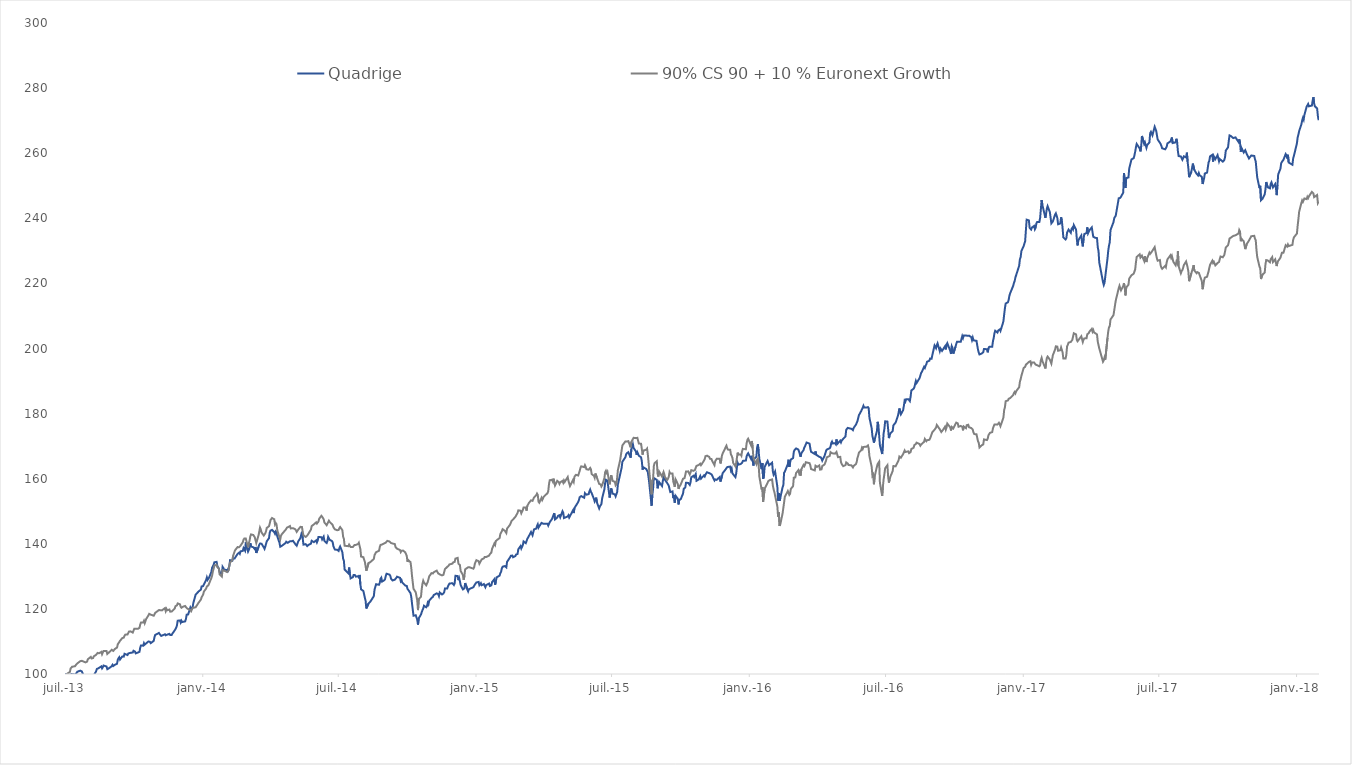
| Category |  Quadrige  |  90% CS 90 + 10 % Euronext Growth  |
|---|---|---|
| 2013-07-02 | 100 | 100 |
| 2013-07-03 | 100 | 99.527 |
| 2013-07-04 | 100 | 100.004 |
| 2013-07-05 | 100 | 100.1 |
| 2013-07-08 | 99.67 | 100.628 |
| 2013-07-09 | 99.74 | 101.683 |
| 2013-07-10 | 99.98 | 101.883 |
| 2013-07-11 | 100.09 | 102.224 |
| 2013-07-12 | 99.94 | 102.246 |
| 2013-07-15 | 99.78 | 102.405 |
| 2013-07-16 | 100.08 | 102.771 |
| 2013-07-17 | 100.35 | 102.888 |
| 2013-07-18 | 100.7 | 103.278 |
| 2013-07-19 | 100.81 | 103.387 |
| 2013-07-22 | 101.04 | 103.96 |
| 2013-07-23 | 101.19 | 104.056 |
| 2013-07-24 | 100.8 | 104.05 |
| 2013-07-25 | 100.83 | 104.173 |
| 2013-07-26 | 99.68 | 103.847 |
| 2013-07-29 | 99.56 | 103.564 |
| 2013-07-30 | 99.83 | 103.442 |
| 2013-07-31 | 99.26 | 103.801 |
| 2013-08-01 | 99.45 | 104.529 |
| 2013-08-02 | 99.39 | 104.623 |
| 2013-08-05 | 99.5 | 105.255 |
| 2013-08-06 | 99.4 | 104.771 |
| 2013-08-07 | 99.12 | 104.736 |
| 2013-08-08 | 98.98 | 104.891 |
| 2013-08-09 | 99.61 | 105.426 |
| 2013-08-12 | 100.8 | 105.894 |
| 2013-08-13 | 101.54 | 106.092 |
| 2013-08-14 | 101.75 | 106.475 |
| 2013-08-15 | 101.75 | 106.183 |
| 2013-08-16 | 101.98 | 106.371 |
| 2013-08-19 | 102.33 | 106.782 |
| 2013-08-20 | 101.74 | 106.075 |
| 2013-08-21 | 102.09 | 106.605 |
| 2013-08-22 | 102.61 | 107.067 |
| 2013-08-23 | 102.81 | 107.349 |
| 2013-08-26 | 102.3 | 107.048 |
| 2013-08-27 | 101.48 | 106.151 |
| 2013-08-28 | 101.39 | 105.879 |
| 2013-08-29 | 101.72 | 106.578 |
| 2013-08-30 | 101.7 | 106.776 |
| 2013-09-02 | 102.41 | 107.444 |
| 2013-09-03 | 102.83 | 107.382 |
| 2013-09-04 | 102.46 | 107.085 |
| 2013-09-05 | 102.72 | 107.311 |
| 2013-09-06 | 102.81 | 107.668 |
| 2013-09-09 | 103.16 | 108.131 |
| 2013-09-10 | 104.36 | 109.126 |
| 2013-09-11 | 104.83 | 109.481 |
| 2013-09-12 | 105.15 | 109.827 |
| 2013-09-13 | 104.45 | 110.193 |
| 2013-09-16 | 105.38 | 111.035 |
| 2013-09-17 | 105.23 | 110.846 |
| 2013-09-18 | 105.34 | 111.174 |
| 2013-09-19 | 106.21 | 111.726 |
| 2013-09-20 | 105.95 | 112.093 |
| 2013-09-23 | 105.83 | 112.144 |
| 2013-09-24 | 106.29 | 112.562 |
| 2013-09-25 | 106.21 | 113.041 |
| 2013-09-26 | 106.46 | 113.1 |
| 2013-09-27 | 106.7 | 113.104 |
| 2013-09-30 | 106.61 | 112.725 |
| 2013-10-01 | 107.13 | 113.304 |
| 2013-10-02 | 107.23 | 113.89 |
| 2013-10-03 | 106.89 | 113.608 |
| 2013-10-04 | 106.34 | 113.881 |
| 2013-10-07 | 106.61 | 113.903 |
| 2013-10-08 | 106.82 | 114.006 |
| 2013-10-09 | 106.82 | 114.184 |
| 2013-10-10 | 108.14 | 115.227 |
| 2013-10-11 | 108.77 | 115.833 |
| 2013-10-14 | 108.69 | 115.819 |
| 2013-10-15 | 109.49 | 116.344 |
| 2013-10-16 | 109.03 | 115.609 |
| 2013-10-17 | 109.01 | 115.806 |
| 2013-10-18 | 109.44 | 116.935 |
| 2013-10-21 | 110 | 118.017 |
| 2013-10-22 | 110.22 | 118.472 |
| 2013-10-23 | 109.88 | 118.165 |
| 2013-10-24 | 109.48 | 118.242 |
| 2013-10-25 | 109.65 | 117.959 |
| 2013-10-28 | 110.18 | 117.906 |
| 2013-10-29 | 111.28 | 118.328 |
| 2013-10-30 | 112.02 | 118.784 |
| 2013-10-31 | 111.98 | 119.022 |
| 2013-11-04 | 112.61 | 119.649 |
| 2013-11-05 | 112.24 | 119.43 |
| 2013-11-06 | 111.99 | 119.592 |
| 2013-11-07 | 111.7 | 119.546 |
| 2013-11-08 | 111.74 | 119.543 |
| 2013-11-12 | 112.2 | 120.237 |
| 2013-11-13 | 111.89 | 119.335 |
| 2013-11-14 | 112.02 | 120.009 |
| 2013-11-15 | 112.09 | 119.57 |
| 2013-11-18 | 112.32 | 119.813 |
| 2013-11-19 | 112 | 119.162 |
| 2013-11-20 | 111.97 | 119.176 |
| 2013-11-21 | 112 | 119.167 |
| 2013-11-22 | 112.43 | 119.356 |
| 2013-11-25 | 113.4 | 120.084 |
| 2013-11-26 | 113.76 | 120.815 |
| 2013-11-27 | 114.2 | 121.044 |
| 2013-11-28 | 114.88 | 121.092 |
| 2013-11-29 | 116.37 | 121.682 |
| 2013-12-02 | 116.46 | 121.428 |
| 2013-12-03 | 115.8 | 120.673 |
| 2013-12-04 | 116.37 | 120.357 |
| 2013-12-05 | 115.96 | 120.342 |
| 2013-12-06 | 116.15 | 120.66 |
| 2013-12-09 | 116.16 | 120.896 |
| 2013-12-10 | 116.87 | 120.567 |
| 2013-12-11 | 118.23 | 120.748 |
| 2013-12-12 | 118.23 | 120.07 |
| 2013-12-13 | 118.3 | 119.882 |
| 2013-12-16 | 120.47 | 119.69 |
| 2013-12-17 | 120.06 | 119.312 |
| 2013-12-18 | 119.84 | 119.494 |
| 2013-12-19 | 120.56 | 120.291 |
| 2013-12-20 | 121.89 | 120.04 |
| 2013-12-23 | 124.37 | 120.505 |
| 2013-12-24 | 124.56 | 120.859 |
| 2013-12-27 | 125.37 | 121.916 |
| 2013-12-30 | 125.92 | 122.861 |
| 2013-12-31 | 126.91 | 123.603 |
| 2014-01-02 | 127 | 124.378 |
| 2014-01-03 | 127.26 | 125.33 |
| 2014-01-06 | 128.88 | 126.251 |
| 2014-01-07 | 129.67 | 126.884 |
| 2014-01-08 | 128.93 | 127.039 |
| 2014-01-09 | 129.09 | 127.242 |
| 2014-01-10 | 129.63 | 127.808 |
| 2014-01-13 | 131.38 | 129.474 |
| 2014-01-14 | 132.66 | 130.226 |
| 2014-01-15 | 132.93 | 131.512 |
| 2014-01-16 | 133.53 | 132.321 |
| 2014-01-17 | 134.32 | 133.272 |
| 2014-01-20 | 134.44 | 133.576 |
| 2014-01-21 | 133.15 | 132.816 |
| 2014-01-22 | 132.79 | 132.885 |
| 2014-01-23 | 132.38 | 132.404 |
| 2014-01-24 | 131.42 | 130.631 |
| 2014-01-27 | 130.61 | 129.953 |
| 2014-01-28 | 132.93 | 131.928 |
| 2014-01-29 | 132.57 | 131.798 |
| 2014-01-30 | 132.01 | 131.79 |
| 2014-01-31 | 131.77 | 131.547 |
| 2014-02-03 | 131.97 | 131.33 |
| 2014-02-04 | 131.28 | 131.173 |
| 2014-02-05 | 132.53 | 131.834 |
| 2014-02-06 | 133.2 | 133.315 |
| 2014-02-07 | 134.96 | 134.232 |
| 2014-02-10 | 134.79 | 135.02 |
| 2014-02-11 | 135.55 | 136.265 |
| 2014-02-12 | 135.58 | 136.399 |
| 2014-02-13 | 135.47 | 137.64 |
| 2014-02-14 | 135.67 | 138.118 |
| 2014-02-17 | 136.89 | 138.988 |
| 2014-02-18 | 137.09 | 138.7 |
| 2014-02-19 | 137.25 | 138.939 |
| 2014-02-20 | 136.92 | 138.859 |
| 2014-02-21 | 137.69 | 139.438 |
| 2014-02-24 | 137.83 | 140.465 |
| 2014-02-25 | 138.68 | 141.287 |
| 2014-02-26 | 138.42 | 141.6 |
| 2014-02-27 | 137.88 | 141.374 |
| 2014-02-28 | 140.44 | 141.595 |
| 2014-03-03 | 137.61 | 138.936 |
| 2014-03-04 | 138.09 | 140.19 |
| 2014-03-05 | 138.78 | 140.935 |
| 2014-03-06 | 140.2 | 142.266 |
| 2014-03-07 | 139.17 | 142.879 |
| 2014-03-10 | 138.93 | 142.706 |
| 2014-03-11 | 138.7 | 142.936 |
| 2014-03-12 | 138.37 | 141.994 |
| 2014-03-13 | 139.03 | 141.804 |
| 2014-03-14 | 137.19 | 140.234 |
| 2014-03-17 | 139.01 | 142.599 |
| 2014-03-18 | 139.71 | 143.774 |
| 2014-03-19 | 140.08 | 144.962 |
| 2014-03-20 | 140.14 | 144.431 |
| 2014-03-21 | 140.04 | 143.493 |
| 2014-03-24 | 138.89 | 142.536 |
| 2014-03-25 | 138.43 | 142.492 |
| 2014-03-26 | 139.12 | 143.212 |
| 2014-03-27 | 139 | 143.849 |
| 2014-03-28 | 140.77 | 144.879 |
| 2014-03-31 | 141.74 | 145.404 |
| 2014-04-01 | 143.45 | 146.243 |
| 2014-04-02 | 144.05 | 147.28 |
| 2014-04-03 | 143.95 | 147.496 |
| 2014-04-04 | 144.27 | 147.919 |
| 2014-04-07 | 143.59 | 147.542 |
| 2014-04-08 | 143.12 | 145.966 |
| 2014-04-09 | 143.8 | 146.369 |
| 2014-04-10 | 143.48 | 146.036 |
| 2014-04-11 | 142.36 | 144.221 |
| 2014-04-14 | 140.31 | 141.997 |
| 2014-04-15 | 139.09 | 141.357 |
| 2014-04-16 | 138.81 | 142.5 |
| 2014-04-17 | 139.35 | 142.916 |
| 2014-04-22 | 140.22 | 144.247 |
| 2014-04-23 | 140.63 | 144.265 |
| 2014-04-24 | 140.87 | 144.972 |
| 2014-04-25 | 140.3 | 144.818 |
| 2014-04-28 | 140.78 | 145.447 |
| 2014-04-29 | 140.83 | 144.717 |
| 2014-04-30 | 140.75 | 144.645 |
| 2014-05-02 | 140.93 | 144.804 |
| 2014-05-05 | 139.94 | 144.468 |
| 2014-05-06 | 139.7 | 144.15 |
| 2014-05-07 | 139.41 | 143.667 |
| 2014-05-09 | 140.72 | 144.364 |
| 2014-05-12 | 141.79 | 145.202 |
| 2014-05-13 | 142.78 | 145.326 |
| 2014-05-14 | 143.69 | 145.184 |
| 2014-05-15 | 141.7 | 143.748 |
| 2014-05-16 | 139.75 | 142.606 |
| 2014-05-19 | 139.9 | 142.115 |
| 2014-05-20 | 139.76 | 142.279 |
| 2014-05-21 | 139.31 | 142.523 |
| 2014-05-22 | 139.17 | 142.857 |
| 2014-05-23 | 139.7 | 143.067 |
| 2014-05-26 | 140.03 | 144.367 |
| 2014-05-27 | 140.93 | 145.451 |
| 2014-05-28 | 141.18 | 145.463 |
| 2014-05-30 | 140.51 | 145.98 |
| 2014-06-02 | 141.07 | 146.598 |
| 2014-06-03 | 140.43 | 146.227 |
| 2014-06-04 | 140.98 | 146.379 |
| 2014-06-05 | 142.07 | 146.808 |
| 2014-06-06 | 142.32 | 147.696 |
| 2014-06-09 | 142.04 | 148.603 |
| 2014-06-10 | 141.36 | 148.539 |
| 2014-06-11 | 141.36 | 147.966 |
| 2014-06-12 | 142.19 | 147.531 |
| 2014-06-13 | 140.87 | 146.544 |
| 2014-06-16 | 140.25 | 145.721 |
| 2014-06-17 | 140.87 | 146.158 |
| 2014-06-18 | 142.16 | 146.407 |
| 2014-06-19 | 142.23 | 147.105 |
| 2014-06-20 | 141.23 | 146.734 |
| 2014-06-23 | 140.87 | 146.07 |
| 2014-06-24 | 140.52 | 145.763 |
| 2014-06-25 | 139.28 | 145.107 |
| 2014-06-26 | 138.72 | 144.924 |
| 2014-06-27 | 138.22 | 144.443 |
| 2014-06-30 | 138.18 | 144.169 |
| 2014-07-01 | 138.07 | 143.88 |
| 2014-07-02 | 137.81 | 144.256 |
| 2014-07-03 | 138.7 | 144.831 |
| 2014-07-04 | 139.18 | 145.152 |
| 2014-07-07 | 137.41 | 144.176 |
| 2014-07-08 | 135.44 | 142.186 |
| 2014-07-09 | 134.8 | 141.55 |
| 2014-07-10 | 132.11 | 139.402 |
| 2014-07-11 | 131.95 | 139.599 |
| 2014-07-15 | 130.92 | 139.268 |
| 2014-07-16 | 132.71 | 139.754 |
| 2014-07-17 | 130.82 | 139.495 |
| 2014-07-18 | 129.37 | 139.004 |
| 2014-07-21 | 129.75 | 139.001 |
| 2014-07-22 | 130.42 | 138.811 |
| 2014-07-23 | 130.53 | 139.602 |
| 2014-07-24 | 130.37 | 139.893 |
| 2014-07-25 | 129.92 | 139.662 |
| 2014-07-28 | 130.03 | 139.943 |
| 2014-07-29 | 129.7 | 140.322 |
| 2014-07-30 | 130.44 | 140.303 |
| 2014-07-31 | 127.62 | 138.374 |
| 2014-08-01 | 126 | 136.084 |
| 2014-08-04 | 125.51 | 135.897 |
| 2014-08-05 | 125.48 | 135.807 |
| 2014-08-06 | 123.47 | 134.489 |
| 2014-08-07 | 122.55 | 133.157 |
| 2014-08-08 | 120.12 | 131.711 |
| 2014-08-11 | 121.68 | 134.119 |
| 2014-08-12 | 121.89 | 134.178 |
| 2014-08-13 | 122.14 | 134.317 |
| 2014-08-14 | 122.45 | 134.482 |
| 2014-08-18 | 123.92 | 135.333 |
| 2014-08-19 | 125.96 | 136.566 |
| 2014-08-20 | 126.09 | 136.657 |
| 2014-08-21 | 127.58 | 137.429 |
| 2014-08-22 | 127.35 | 137.256 |
| 2014-08-25 | 127.42 | 137.884 |
| 2014-08-26 | 128.09 | 139.063 |
| 2014-08-27 | 129.28 | 139.655 |
| 2014-08-28 | 129.59 | 139.831 |
| 2014-08-29 | 128.39 | 139.794 |
| 2014-09-01 | 128.8 | 140.125 |
| 2014-09-02 | 129.16 | 140.238 |
| 2014-09-03 | 130.17 | 140.373 |
| 2014-09-04 | 130.8 | 140.554 |
| 2014-09-05 | 130.96 | 140.905 |
| 2014-09-08 | 130.53 | 140.697 |
| 2014-09-09 | 130.16 | 140.489 |
| 2014-09-10 | 129.28 | 140.239 |
| 2014-09-11 | 129.34 | 140.323 |
| 2014-09-12 | 128.74 | 140.086 |
| 2014-09-15 | 128.97 | 139.929 |
| 2014-09-16 | 128.74 | 138.987 |
| 2014-09-17 | 129.52 | 138.783 |
| 2014-09-18 | 129.9 | 138.505 |
| 2014-09-19 | 129.87 | 138.322 |
| 2014-09-22 | 129.54 | 138.085 |
| 2014-09-23 | 128.5 | 137.459 |
| 2014-09-24 | 128.82 | 137.854 |
| 2014-09-25 | 128.11 | 137.771 |
| 2014-09-26 | 128.02 | 137.93 |
| 2014-09-29 | 127.16 | 137.38 |
| 2014-09-30 | 127.36 | 137.223 |
| 2014-10-01 | 127.04 | 136.295 |
| 2014-10-02 | 126.18 | 134.444 |
| 2014-10-03 | 126.16 | 134.994 |
| 2014-10-06 | 124.83 | 134.371 |
| 2014-10-07 | 123.7 | 132.651 |
| 2014-10-08 | 121.69 | 130.174 |
| 2014-10-09 | 121.57 | 130.154 |
| 2014-10-10 | 117.91 | 126.181 |
| 2014-10-13 | 118.05 | 125.103 |
| 2014-10-14 | 117.97 | 124.87 |
| 2014-10-15 | 116.66 | 122.617 |
| 2014-10-16 | 115.18 | 119.626 |
| 2014-10-17 | 117.12 | 122.996 |
| 2014-10-20 | 118.28 | 123.73 |
| 2014-10-21 | 119.01 | 126.178 |
| 2014-10-22 | 119.63 | 127.734 |
| 2014-10-23 | 120.11 | 128.668 |
| 2014-10-24 | 120.98 | 128.11 |
| 2014-10-27 | 120.5 | 127.252 |
| 2014-10-28 | 120.86 | 127.294 |
| 2014-10-29 | 121.87 | 128.268 |
| 2014-10-30 | 121.43 | 128.483 |
| 2014-10-31 | 122.54 | 129.994 |
| 2014-11-03 | 123.33 | 130.981 |
| 2014-11-04 | 123.43 | 131.003 |
| 2014-11-05 | 123.74 | 130.9 |
| 2014-11-06 | 124.27 | 131.26 |
| 2014-11-07 | 124.16 | 131.253 |
| 2014-11-10 | 124.76 | 131.752 |
| 2014-11-12 | 124.53 | 130.893 |
| 2014-11-13 | 123.92 | 130.849 |
| 2014-11-14 | 125.07 | 130.624 |
| 2014-11-17 | 124.42 | 130.295 |
| 2014-11-18 | 124.47 | 130.276 |
| 2014-11-19 | 124.76 | 130.477 |
| 2014-11-20 | 125.15 | 130.734 |
| 2014-11-21 | 126.24 | 132.222 |
| 2014-11-24 | 126.27 | 132.884 |
| 2014-11-25 | 126.88 | 132.773 |
| 2014-11-26 | 127.4 | 133.325 |
| 2014-11-27 | 127.78 | 133.663 |
| 2014-11-28 | 127.86 | 133.76 |
| 2014-12-01 | 127.9 | 133.908 |
| 2014-12-02 | 127.72 | 134.289 |
| 2014-12-03 | 127.35 | 134.184 |
| 2014-12-04 | 127.87 | 134.448 |
| 2014-12-05 | 130.16 | 135.438 |
| 2014-12-08 | 130.12 | 135.665 |
| 2014-12-09 | 128.83 | 133.912 |
| 2014-12-10 | 129.47 | 133.852 |
| 2014-12-11 | 128.5 | 133.469 |
| 2014-12-12 | 127.31 | 131.639 |
| 2014-12-15 | 125.98 | 130.432 |
| 2014-12-16 | 125.98 | 128.95 |
| 2014-12-17 | 126.31 | 130.141 |
| 2014-12-18 | 127.93 | 132.154 |
| 2014-12-19 | 127.66 | 132.327 |
| 2014-12-22 | 125.41 | 132.795 |
| 2014-12-23 | 126.03 | 132.734 |
| 2014-12-24 | 126.24 | 132.77 |
| 2014-12-29 | 126.67 | 132.359 |
| 2014-12-30 | 126.95 | 132.796 |
| 2014-12-31 | 127.51 | 133.923 |
| 2015-01-02 | 128.12 | 134.971 |
| 2015-01-05 | 128.28 | 134.662 |
| 2015-01-06 | 127.3 | 133.895 |
| 2015-01-07 | 127.05 | 133.904 |
| 2015-01-08 | 127.91 | 134.745 |
| 2015-01-09 | 127.28 | 135.196 |
| 2015-01-12 | 127.63 | 135.518 |
| 2015-01-13 | 127.61 | 135.955 |
| 2015-01-14 | 126.65 | 135.882 |
| 2015-01-15 | 127.31 | 135.92 |
| 2015-01-16 | 127.4 | 135.827 |
| 2015-01-19 | 127.79 | 136.379 |
| 2015-01-20 | 127.03 | 136.814 |
| 2015-01-21 | 126.76 | 136.685 |
| 2015-01-22 | 127.25 | 137.328 |
| 2015-01-23 | 128.26 | 138.482 |
| 2015-01-26 | 129.13 | 140.089 |
| 2015-01-27 | 127.43 | 139.66 |
| 2015-01-28 | 128.41 | 140.852 |
| 2015-01-29 | 129.69 | 140.879 |
| 2015-01-30 | 129.65 | 141.246 |
| 2015-02-02 | 130.22 | 141.764 |
| 2015-02-03 | 130.98 | 143.033 |
| 2015-02-04 | 131.42 | 143.282 |
| 2015-02-05 | 132.47 | 143.848 |
| 2015-02-06 | 132.96 | 144.488 |
| 2015-02-09 | 133.16 | 144.009 |
| 2015-02-10 | 133.15 | 144.164 |
| 2015-02-11 | 132.76 | 143.314 |
| 2015-02-12 | 134.48 | 144.674 |
| 2015-02-13 | 134.59 | 144.905 |
| 2015-02-16 | 135.83 | 145.867 |
| 2015-02-17 | 136.31 | 146.061 |
| 2015-02-18 | 136.3 | 147.046 |
| 2015-02-19 | 136.39 | 147.201 |
| 2015-02-20 | 135.87 | 147.485 |
| 2015-02-23 | 136.23 | 148.257 |
| 2015-02-24 | 136.67 | 148.668 |
| 2015-02-25 | 136.6 | 148.88 |
| 2015-02-26 | 136.89 | 149.475 |
| 2015-02-27 | 138.32 | 150.278 |
| 2015-03-02 | 139.31 | 150.175 |
| 2015-03-03 | 138.57 | 149.383 |
| 2015-03-04 | 138.62 | 149.417 |
| 2015-03-05 | 139.57 | 150.343 |
| 2015-03-06 | 140.73 | 151.15 |
| 2015-03-09 | 140.19 | 151.167 |
| 2015-03-10 | 140.04 | 150.188 |
| 2015-03-11 | 141.5 | 151.613 |
| 2015-03-12 | 141.62 | 151.592 |
| 2015-03-13 | 142.32 | 152.509 |
| 2015-03-16 | 143.63 | 153.358 |
| 2015-03-17 | 143.41 | 153.17 |
| 2015-03-18 | 142.64 | 153.197 |
| 2015-03-19 | 142.85 | 153.435 |
| 2015-03-20 | 144.43 | 154.251 |
| 2015-03-23 | 144.68 | 154.954 |
| 2015-03-24 | 145.52 | 155.439 |
| 2015-03-25 | 145.99 | 155.031 |
| 2015-03-26 | 144.99 | 152.942 |
| 2015-03-27 | 145.39 | 152.627 |
| 2015-03-30 | 146.42 | 154.131 |
| 2015-03-31 | 146.15 | 153.466 |
| 2015-04-01 | 146.19 | 153.688 |
| 2015-04-02 | 146.27 | 154.445 |
| 2015-04-07 | 146.19 | 155.576 |
| 2015-04-08 | 145.61 | 156.183 |
| 2015-04-09 | 145.53 | 158.334 |
| 2015-04-10 | 146.65 | 159.523 |
| 2015-04-13 | 147.63 | 159.675 |
| 2015-04-14 | 147.66 | 159.167 |
| 2015-04-15 | 148.82 | 160.027 |
| 2015-04-16 | 149.41 | 160.011 |
| 2015-04-17 | 147.49 | 157.908 |
| 2015-04-20 | 148.05 | 159.341 |
| 2015-04-21 | 148.57 | 159.454 |
| 2015-04-22 | 148.74 | 158.948 |
| 2015-04-23 | 148.79 | 158.407 |
| 2015-04-24 | 148.14 | 158.891 |
| 2015-04-27 | 150 | 159.334 |
| 2015-04-28 | 149.54 | 158.772 |
| 2015-04-29 | 147.91 | 159.474 |
| 2015-04-30 | 147.85 | 159.018 |
| 2015-05-04 | 148.41 | 160.519 |
| 2015-05-05 | 148.77 | 159.313 |
| 2015-05-06 | 148.07 | 158.552 |
| 2015-05-07 | 147.9 | 157.759 |
| 2015-05-11 | 150.26 | 159.557 |
| 2015-05-12 | 149.45 | 159.016 |
| 2015-05-13 | 151.01 | 160.612 |
| 2015-05-15 | 151.72 | 161.2 |
| 2015-05-18 | 152.85 | 160.983 |
| 2015-05-19 | 153.46 | 161.706 |
| 2015-05-20 | 154.31 | 162.403 |
| 2015-05-21 | 154.6 | 163.292 |
| 2015-05-22 | 154.65 | 163.801 |
| 2015-05-26 | 154.15 | 163.548 |
| 2015-05-27 | 155.57 | 164.147 |
| 2015-05-28 | 155.53 | 163.657 |
| 2015-05-29 | 155.09 | 162.897 |
| 2015-06-01 | 155.27 | 162.772 |
| 2015-06-02 | 156.13 | 162.927 |
| 2015-06-03 | 156.66 | 163.314 |
| 2015-06-04 | 155.93 | 162.843 |
| 2015-06-05 | 155.56 | 161.417 |
| 2015-06-08 | 153.79 | 160.882 |
| 2015-06-09 | 153.03 | 160.292 |
| 2015-06-10 | 153.57 | 161.607 |
| 2015-06-11 | 154.18 | 161.719 |
| 2015-06-12 | 152.71 | 160.3 |
| 2015-06-15 | 150.87 | 158.411 |
| 2015-06-16 | 151.5 | 158.42 |
| 2015-06-17 | 151.79 | 158.228 |
| 2015-06-18 | 152.22 | 157.595 |
| 2015-06-19 | 153.97 | 157.971 |
| 2015-06-22 | 156.78 | 160.193 |
| 2015-06-23 | 158.72 | 161.994 |
| 2015-06-24 | 159.68 | 162.43 |
| 2015-06-25 | 159.53 | 161.794 |
| 2015-06-26 | 159.43 | 162.169 |
| 2015-06-29 | 154.21 | 158.285 |
| 2015-06-30 | 153.98 | 158.454 |
| 2015-07-01 | 157 | 161.087 |
| 2015-07-02 | 156.35 | 160.283 |
| 2015-07-03 | 155.42 | 159.343 |
| 2015-07-06 | 155.15 | 158.987 |
| 2015-07-07 | 154.58 | 157.972 |
| 2015-07-08 | 154.48 | 158.285 |
| 2015-07-09 | 155.88 | 160.231 |
| 2015-07-10 | 158.22 | 162.647 |
| 2015-07-13 | 161.3 | 165.682 |
| 2015-07-15 | 163.35 | 168.702 |
| 2015-07-16 | 165.22 | 170.187 |
| 2015-07-17 | 165.23 | 170.527 |
| 2015-07-20 | 166.59 | 171.457 |
| 2015-07-21 | 167.44 | 171.546 |
| 2015-07-22 | 167.82 | 171.408 |
| 2015-07-23 | 167.69 | 171.245 |
| 2015-07-24 | 168.13 | 171.545 |
| 2015-07-27 | 166.46 | 169.631 |
| 2015-07-28 | 169.05 | 171.302 |
| 2015-07-29 | 170.03 | 171.739 |
| 2015-07-30 | 170.66 | 172.158 |
| 2015-07-31 | 169.45 | 172.561 |
| 2015-08-03 | 168.4 | 172.467 |
| 2015-08-04 | 167.36 | 172.2 |
| 2015-08-05 | 168.11 | 172.564 |
| 2015-08-06 | 167.84 | 172.346 |
| 2015-08-07 | 167.07 | 170.822 |
| 2015-08-10 | 166.57 | 170.728 |
| 2015-08-11 | 165.34 | 170.483 |
| 2015-08-12 | 162.79 | 167.392 |
| 2015-08-13 | 163.51 | 168.652 |
| 2015-08-14 | 163.34 | 168.926 |
| 2015-08-17 | 162.96 | 168.909 |
| 2015-08-18 | 162.68 | 169.245 |
| 2015-08-19 | 162.02 | 167.458 |
| 2015-08-20 | 160.33 | 165.055 |
| 2015-08-21 | 158.48 | 162.02 |
| 2015-08-24 | 151.71 | 155.217 |
| 2015-08-25 | 154.92 | 159.529 |
| 2015-08-26 | 156.86 | 159.927 |
| 2015-08-27 | 160.22 | 163.877 |
| 2015-08-28 | 160.04 | 164.77 |
| 2015-08-31 | 159.65 | 165.366 |
| 2015-09-01 | 157.05 | 161.573 |
| 2015-09-02 | 156.96 | 160.653 |
| 2015-09-03 | 159.02 | 162.242 |
| 2015-09-07 | 157.74 | 160.653 |
| 2015-09-08 | 159.28 | 161.395 |
| 2015-09-09 | 160.38 | 162.054 |
| 2015-09-10 | 160.04 | 161.373 |
| 2015-09-11 | 159.65 | 160.423 |
| 2015-09-14 | 158.62 | 159.651 |
| 2015-09-15 | 158.24 | 160.02 |
| 2015-09-16 | 157.8 | 160.595 |
| 2015-09-17 | 157.5 | 162.043 |
| 2015-09-18 | 155.91 | 161.601 |
| 2015-09-21 | 156.09 | 161.57 |
| 2015-09-22 | 154.03 | 159.109 |
| 2015-09-23 | 154.92 | 159.179 |
| 2015-09-24 | 152.65 | 157.52 |
| 2015-09-25 | 154.78 | 159.821 |
| 2015-09-28 | 153.86 | 158.384 |
| 2015-09-29 | 152.1 | 156.89 |
| 2015-09-30 | 153.52 | 157.534 |
| 2015-10-01 | 153.28 | 157.849 |
| 2015-10-02 | 153.71 | 158.228 |
| 2015-10-05 | 155.42 | 159.993 |
| 2015-10-06 | 156.89 | 160.049 |
| 2015-10-07 | 157.19 | 160.181 |
| 2015-10-08 | 157.31 | 161.095 |
| 2015-10-09 | 158.75 | 162.234 |
| 2015-10-12 | 158.7 | 162.249 |
| 2015-10-13 | 158.45 | 161.77 |
| 2015-10-14 | 158.09 | 161.294 |
| 2015-10-15 | 158.81 | 161.915 |
| 2015-10-16 | 160.45 | 162.614 |
| 2015-10-19 | 160.89 | 162.425 |
| 2015-10-20 | 160.5 | 162.261 |
| 2015-10-21 | 160.79 | 162.7 |
| 2015-10-22 | 161.44 | 163.389 |
| 2015-10-23 | 159.35 | 163.941 |
| 2015-10-26 | 159.77 | 164.218 |
| 2015-10-27 | 159.52 | 163.929 |
| 2015-10-28 | 160.8 | 164.624 |
| 2015-10-29 | 160.02 | 164.172 |
| 2015-10-30 | 160.19 | 164.496 |
| 2015-11-02 | 161 | 165.554 |
| 2015-11-03 | 160.69 | 166.026 |
| 2015-11-04 | 161.27 | 166.924 |
| 2015-11-05 | 161.12 | 166.93 |
| 2015-11-06 | 161.98 | 167.08 |
| 2015-11-09 | 161.71 | 166.705 |
| 2015-11-10 | 161.53 | 166.122 |
| 2015-11-12 | 161.35 | 166.042 |
| 2015-11-13 | 160.93 | 165.434 |
| 2015-11-16 | 159.45 | 164.167 |
| 2015-11-17 | 159.78 | 165.379 |
| 2015-11-18 | 159.85 | 165.331 |
| 2015-11-19 | 159.64 | 166.11 |
| 2015-11-20 | 159.52 | 166.236 |
| 2015-11-23 | 160.52 | 166.094 |
| 2015-11-24 | 159.11 | 164.68 |
| 2015-11-25 | 159.15 | 165.555 |
| 2015-11-26 | 160.77 | 167.108 |
| 2015-11-27 | 161.71 | 167.762 |
| 2015-11-30 | 162.59 | 169.171 |
| 2015-12-01 | 162.91 | 169.706 |
| 2015-12-02 | 162.87 | 170.145 |
| 2015-12-03 | 163.56 | 169.414 |
| 2015-12-04 | 163.52 | 168.938 |
| 2015-12-07 | 163.73 | 168.899 |
| 2015-12-08 | 162.56 | 167.433 |
| 2015-12-09 | 163.08 | 167.016 |
| 2015-12-10 | 161.63 | 166.392 |
| 2015-12-11 | 161.74 | 164.845 |
| 2015-12-14 | 160.48 | 163.781 |
| 2015-12-15 | 161.55 | 164.881 |
| 2015-12-16 | 163.54 | 166.384 |
| 2015-12-17 | 164.88 | 168.005 |
| 2015-12-18 | 164.33 | 167.381 |
| 2015-12-21 | 164.49 | 167.467 |
| 2015-12-22 | 164.69 | 167.078 |
| 2015-12-23 | 164.91 | 168.541 |
| 2015-12-24 | 165.48 | 169.161 |
| 2015-12-28 | 165.57 | 169.035 |
| 2015-12-29 | 166.91 | 170.923 |
| 2015-12-30 | 167.44 | 171.938 |
| 2015-12-31 | 167.8 | 172.28 |
| 2016-01-04 | 166.03 | 170.2 |
| 2016-01-05 | 167.05 | 171.589 |
| 2016-01-06 | 166.14 | 169.661 |
| 2016-01-07 | 164.03 | 166.496 |
| 2016-01-08 | 166.04 | 165.824 |
| 2016-01-11 | 166.74 | 164.488 |
| 2016-01-12 | 169.6 | 165.852 |
| 2016-01-13 | 170.58 | 166.169 |
| 2016-01-14 | 168.32 | 164.287 |
| 2016-01-15 | 166.05 | 160.586 |
| 2016-01-18 | 162.93 | 156.7 |
| 2016-01-19 | 164.78 | 157.443 |
| 2016-01-20 | 159.99 | 152.9 |
| 2016-01-21 | 160.65 | 153.171 |
| 2016-01-22 | 163.58 | 156.876 |
| 2016-01-25 | 165.02 | 158.276 |
| 2016-01-26 | 165.44 | 158.365 |
| 2016-01-27 | 165.3 | 159.278 |
| 2016-01-28 | 164.13 | 158.995 |
| 2016-01-29 | 164.03 | 159.572 |
| 2016-02-01 | 164.92 | 159.781 |
| 2016-02-02 | 162.25 | 157.906 |
| 2016-02-03 | 161.26 | 156.72 |
| 2016-02-04 | 161.69 | 155.93 |
| 2016-02-05 | 162.2 | 155.715 |
| 2016-02-08 | 157.57 | 151.493 |
| 2016-02-09 | 153.25 | 148.302 |
| 2016-02-10 | 155.57 | 149.705 |
| 2016-02-11 | 153.21 | 145.511 |
| 2016-02-12 | 154.17 | 146.039 |
| 2016-02-15 | 157.38 | 149.347 |
| 2016-02-16 | 157.99 | 149.122 |
| 2016-02-17 | 161.8 | 152.679 |
| 2016-02-18 | 162.17 | 154.425 |
| 2016-02-19 | 162.2 | 154.544 |
| 2016-02-22 | 164.49 | 156.203 |
| 2016-02-23 | 165.83 | 156.299 |
| 2016-02-24 | 163.6 | 155.043 |
| 2016-02-25 | 164.96 | 155.365 |
| 2016-02-26 | 165.87 | 156.864 |
| 2016-02-29 | 166.33 | 157.693 |
| 2016-03-01 | 168.27 | 160.305 |
| 2016-03-02 | 168.8 | 160.411 |
| 2016-03-03 | 168.97 | 160.408 |
| 2016-03-04 | 169.29 | 161.721 |
| 2016-03-07 | 168.95 | 162.611 |
| 2016-03-08 | 168.38 | 161.696 |
| 2016-03-09 | 167.55 | 162.149 |
| 2016-03-10 | 166.75 | 160.9 |
| 2016-03-11 | 167.82 | 162.835 |
| 2016-03-14 | 168.78 | 164.211 |
| 2016-03-15 | 169.59 | 163.864 |
| 2016-03-16 | 169.97 | 164.326 |
| 2016-03-17 | 169.72 | 165.053 |
| 2016-03-18 | 171.11 | 165.334 |
| 2016-03-22 | 170.77 | 164.769 |
| 2016-03-23 | 169.38 | 164.152 |
| 2016-03-24 | 168.28 | 162.974 |
| 2016-03-29 | 167.58 | 162.548 |
| 2016-03-30 | 168.38 | 163.986 |
| 2016-03-31 | 167.35 | 163.805 |
| 2016-04-01 | 167.14 | 163.635 |
| 2016-04-04 | 166.72 | 164.074 |
| 2016-04-05 | 166.67 | 162.781 |
| 2016-04-06 | 166.57 | 162.9 |
| 2016-04-07 | 166.17 | 162.872 |
| 2016-04-08 | 165.56 | 163.896 |
| 2016-04-11 | 166.96 | 164.359 |
| 2016-04-12 | 167.18 | 164.257 |
| 2016-04-13 | 168.48 | 165.499 |
| 2016-04-14 | 168.95 | 166.551 |
| 2016-04-15 | 169.15 | 166.739 |
| 2016-04-18 | 169.36 | 167.012 |
| 2016-04-19 | 169.82 | 168.167 |
| 2016-04-20 | 171 | 168.312 |
| 2016-04-21 | 171.4 | 167.811 |
| 2016-04-22 | 170.83 | 167.52 |
| 2016-04-25 | 170.91 | 167.693 |
| 2016-04-26 | 170.6 | 167.777 |
| 2016-04-27 | 172.07 | 168.222 |
| 2016-04-28 | 170.69 | 168.023 |
| 2016-04-29 | 170.71 | 166.608 |
| 2016-05-02 | 171.68 | 166.699 |
| 2016-05-03 | 171.15 | 165.083 |
| 2016-05-04 | 171.73 | 164.497 |
| 2016-05-06 | 172.25 | 163.844 |
| 2016-05-09 | 172.97 | 164.179 |
| 2016-05-10 | 175.03 | 165.007 |
| 2016-05-11 | 175.22 | 165.065 |
| 2016-05-12 | 175.6 | 164.667 |
| 2016-05-13 | 175.86 | 164.213 |
| 2016-05-17 | 175.31 | 164.099 |
| 2016-05-18 | 175.1 | 164.097 |
| 2016-05-19 | 174.91 | 163.463 |
| 2016-05-20 | 175.64 | 163.944 |
| 2016-05-23 | 176.61 | 164.503 |
| 2016-05-24 | 176.77 | 165.138 |
| 2016-05-25 | 177.68 | 166.417 |
| 2016-05-26 | 178.59 | 167.08 |
| 2016-05-27 | 179.53 | 168.053 |
| 2016-05-30 | 180.78 | 168.726 |
| 2016-05-31 | 181.31 | 169.515 |
| 2016-06-01 | 181.79 | 169.137 |
| 2016-06-02 | 182.4 | 169.762 |
| 2016-06-03 | 181.84 | 169.866 |
| 2016-06-06 | 181.84 | 169.816 |
| 2016-06-07 | 182 | 170.109 |
| 2016-06-08 | 182 | 170.217 |
| 2016-06-09 | 181.67 | 169.293 |
| 2016-06-10 | 178.73 | 166.897 |
| 2016-06-13 | 175.49 | 163.647 |
| 2016-06-14 | 173.12 | 160.885 |
| 2016-06-15 | 173.3 | 161.252 |
| 2016-06-16 | 171.09 | 158.296 |
| 2016-06-17 | 172.02 | 160.688 |
| 2016-06-20 | 174.65 | 163.721 |
| 2016-06-21 | 177.47 | 164.539 |
| 2016-06-22 | 176.26 | 164.429 |
| 2016-06-23 | 176.54 | 165.222 |
| 2016-06-24 | 170.3 | 158.796 |
| 2016-06-27 | 167.57 | 154.711 |
| 2016-06-28 | 170.86 | 157.644 |
| 2016-06-29 | 173.98 | 159.895 |
| 2016-06-30 | 175.34 | 161.419 |
| 2016-07-01 | 177.63 | 163.201 |
| 2016-07-04 | 177.55 | 164.143 |
| 2016-07-05 | 175.18 | 160.57 |
| 2016-07-06 | 172.47 | 158.805 |
| 2016-07-07 | 173.32 | 159.741 |
| 2016-07-08 | 173.95 | 160.647 |
| 2016-07-11 | 174.61 | 162.325 |
| 2016-07-12 | 176.39 | 163.899 |
| 2016-07-13 | 176.63 | 163.983 |
| 2016-07-15 | 177.26 | 163.793 |
| 2016-07-18 | 179.31 | 165.235 |
| 2016-07-19 | 180.32 | 165.706 |
| 2016-07-20 | 181.57 | 166.816 |
| 2016-07-21 | 181.4 | 166.703 |
| 2016-07-22 | 179.79 | 166.442 |
| 2016-07-25 | 181.04 | 167.569 |
| 2016-07-26 | 182.41 | 167.324 |
| 2016-07-27 | 183.98 | 168.648 |
| 2016-07-28 | 183.66 | 168.197 |
| 2016-07-29 | 184.42 | 167.988 |
| 2016-08-01 | 184.42 | 168.396 |
| 2016-08-02 | 184.32 | 167.85 |
| 2016-08-03 | 183.83 | 167.945 |
| 2016-08-04 | 185.25 | 168.184 |
| 2016-08-05 | 187.13 | 169.128 |
| 2016-08-08 | 187.63 | 169.51 |
| 2016-08-09 | 188.11 | 170.335 |
| 2016-08-10 | 188.37 | 170.239 |
| 2016-08-11 | 190.02 | 170.667 |
| 2016-08-12 | 189.4 | 171.084 |
| 2016-08-16 | 190.91 | 170.634 |
| 2016-08-17 | 190.69 | 170.141 |
| 2016-08-18 | 192.43 | 170.492 |
| 2016-08-19 | 192.82 | 170.384 |
| 2016-08-22 | 194.36 | 171.33 |
| 2016-08-23 | 194.04 | 172.211 |
| 2016-08-24 | 194.71 | 172.258 |
| 2016-08-25 | 195.16 | 171.515 |
| 2016-08-26 | 195.95 | 171.831 |
| 2016-08-29 | 196.23 | 171.943 |
| 2016-08-30 | 196.9 | 172.41 |
| 2016-08-31 | 197.02 | 172.952 |
| 2016-09-01 | 196.84 | 173.076 |
| 2016-09-02 | 197.95 | 174.287 |
| 2016-09-05 | 200.96 | 175.058 |
| 2016-09-06 | 200.6 | 175.147 |
| 2016-09-07 | 200.13 | 175.711 |
| 2016-09-08 | 201.02 | 176.507 |
| 2016-09-09 | 201.58 | 176.51 |
| 2016-09-12 | 199.17 | 175.177 |
| 2016-09-13 | 199.99 | 175.082 |
| 2016-09-14 | 199.71 | 174.35 |
| 2016-09-15 | 199.27 | 174.577 |
| 2016-09-16 | 199.43 | 174.904 |
| 2016-09-19 | 200.7 | 175.982 |
| 2016-09-20 | 199.71 | 175.07 |
| 2016-09-21 | 201.13 | 175.724 |
| 2016-09-22 | 201.64 | 176.936 |
| 2016-09-23 | 201.34 | 176.886 |
| 2016-09-26 | 199.26 | 175.75 |
| 2016-09-27 | 198.34 | 174.819 |
| 2016-09-28 | 200.71 | 175.9 |
| 2016-09-29 | 200.24 | 176.077 |
| 2016-09-30 | 198.43 | 175.448 |
| 2016-10-03 | 200.55 | 176.856 |
| 2016-10-04 | 201.43 | 177.227 |
| 2016-10-05 | 202.08 | 177.264 |
| 2016-10-06 | 201.85 | 177.004 |
| 2016-10-07 | 202.08 | 175.959 |
| 2016-10-10 | 202.06 | 176.209 |
| 2016-10-11 | 203 | 176.055 |
| 2016-10-12 | 203.83 | 175.943 |
| 2016-10-13 | 203.24 | 174.868 |
| 2016-10-14 | 204 | 176.043 |
| 2016-10-17 | 204 | 175.523 |
| 2016-10-18 | 204.14 | 176.437 |
| 2016-10-19 | 203.9 | 176.725 |
| 2016-10-20 | 204.01 | 176.573 |
| 2016-10-21 | 203.95 | 175.799 |
| 2016-10-24 | 203.49 | 175.566 |
| 2016-10-25 | 202.6 | 175.39 |
| 2016-10-26 | 203.36 | 175.089 |
| 2016-10-27 | 202.51 | 174.171 |
| 2016-10-28 | 202.21 | 173.71 |
| 2016-10-31 | 202.35 | 173.639 |
| 2016-11-02 | 199.65 | 171.518 |
| 2016-11-03 | 198.75 | 171.082 |
| 2016-11-04 | 198.17 | 169.585 |
| 2016-11-07 | 198.45 | 170.262 |
| 2016-11-08 | 198.62 | 170.143 |
| 2016-11-09 | 198.87 | 170.525 |
| 2016-11-10 | 199.83 | 172.058 |
| 2016-11-14 | 199.79 | 171.873 |
| 2016-11-15 | 198.83 | 172.352 |
| 2016-11-16 | 200.02 | 173.352 |
| 2016-11-17 | 200.5 | 173.515 |
| 2016-11-18 | 200.72 | 174.084 |
| 2016-11-21 | 200.55 | 174.327 |
| 2016-11-22 | 202.23 | 175.482 |
| 2016-11-23 | 203.25 | 176.099 |
| 2016-11-24 | 204.72 | 176.626 |
| 2016-11-25 | 205.45 | 176.447 |
| 2016-11-28 | 204.9 | 176.614 |
| 2016-11-29 | 205.52 | 176.45 |
| 2016-11-30 | 205.76 | 177.177 |
| 2016-12-01 | 205.85 | 176.763 |
| 2016-12-02 | 205.38 | 176.146 |
| 2016-12-05 | 207.58 | 178.095 |
| 2016-12-06 | 208.42 | 178.821 |
| 2016-12-07 | 210.49 | 181.158 |
| 2016-12-08 | 212.41 | 181.964 |
| 2016-12-09 | 213.83 | 183.808 |
| 2016-12-12 | 214.2 | 184.051 |
| 2016-12-13 | 214.97 | 184.564 |
| 2016-12-14 | 216.26 | 184.438 |
| 2016-12-15 | 216.96 | 184.766 |
| 2016-12-16 | 217.23 | 184.718 |
| 2016-12-19 | 219.25 | 185.69 |
| 2016-12-20 | 220.12 | 186.298 |
| 2016-12-21 | 220.73 | 186.647 |
| 2016-12-22 | 221.86 | 186.23 |
| 2016-12-23 | 222.54 | 186.865 |
| 2016-12-27 | 225.42 | 188.122 |
| 2016-12-28 | 227.44 | 189.794 |
| 2016-12-29 | 228.09 | 190.585 |
| 2016-12-30 | 229.95 | 191.626 |
| 2017-01-02 | 231.47 | 194.018 |
| 2017-01-03 | 231.43 | 194.174 |
| 2017-01-04 | 232.98 | 194.365 |
| 2017-01-05 | 236.37 | 195.015 |
| 2017-01-06 | 239.58 | 195.104 |
| 2017-01-09 | 239.36 | 195.894 |
| 2017-01-10 | 237.06 | 196.135 |
| 2017-01-11 | 236.99 | 196.091 |
| 2017-01-12 | 236.54 | 195.019 |
| 2017-01-13 | 237.16 | 195.662 |
| 2017-01-16 | 237.66 | 195.694 |
| 2017-01-17 | 236.63 | 195.526 |
| 2017-01-18 | 237.08 | 195.053 |
| 2017-01-19 | 238.44 | 195.166 |
| 2017-01-20 | 238.89 | 194.869 |
| 2017-01-23 | 238.88 | 194.523 |
| 2017-01-24 | 240.13 | 194.848 |
| 2017-01-25 | 242.81 | 196.416 |
| 2017-01-26 | 245.62 | 197.121 |
| 2017-01-27 | 244.07 | 196.175 |
| 2017-01-30 | 241.19 | 194.483 |
| 2017-01-31 | 240.16 | 193.868 |
| 2017-02-01 | 241.49 | 195.7 |
| 2017-02-02 | 242.99 | 197.108 |
| 2017-02-03 | 243.74 | 197.525 |
| 2017-02-06 | 241.89 | 196.582 |
| 2017-02-08 | 238.44 | 195.371 |
| 2017-02-09 | 238.26 | 195.391 |
| 2017-02-10 | 239.04 | 197.924 |
| 2017-02-13 | 241.15 | 199.716 |
| 2017-02-14 | 241.53 | 200.672 |
| 2017-02-15 | 240.83 | 200.952 |
| 2017-02-16 | 240.08 | 200.582 |
| 2017-02-17 | 238.17 | 199.305 |
| 2017-02-20 | 238.41 | 199.485 |
| 2017-02-21 | 240.32 | 200.322 |
| 2017-02-22 | 239.31 | 200.086 |
| 2017-02-23 | 236.99 | 198.831 |
| 2017-02-24 | 234.15 | 196.944 |
| 2017-02-27 | 233.5 | 196.928 |
| 2017-02-28 | 233.83 | 198.046 |
| 2017-03-01 | 235.6 | 200.656 |
| 2017-03-02 | 235.79 | 201.165 |
| 2017-03-03 | 236.52 | 201.8 |
| 2017-03-06 | 235.55 | 202.02 |
| 2017-03-07 | 236.72 | 201.855 |
| 2017-03-08 | 237.08 | 202.66 |
| 2017-03-09 | 236.65 | 202.663 |
| 2017-03-10 | 237.92 | 204.685 |
| 2017-03-13 | 236.54 | 204.342 |
| 2017-03-14 | 233.69 | 202.653 |
| 2017-03-15 | 231.67 | 202.219 |
| 2017-03-16 | 233.28 | 202.272 |
| 2017-03-17 | 233.62 | 202.842 |
| 2017-03-20 | 234.72 | 203.768 |
| 2017-03-21 | 232.61 | 203.507 |
| 2017-03-22 | 231.37 | 202.011 |
| 2017-03-23 | 233.78 | 202.703 |
| 2017-03-24 | 235.16 | 203.094 |
| 2017-03-27 | 235.49 | 203.157 |
| 2017-03-28 | 237.22 | 204.367 |
| 2017-03-29 | 235.39 | 204.27 |
| 2017-03-30 | 235.51 | 204.74 |
| 2017-03-31 | 236.36 | 205.24 |
| 2017-04-03 | 237.2 | 206.02 |
| 2017-04-04 | 235.73 | 205.19 |
| 2017-04-05 | 234.34 | 205.67 |
| 2017-04-06 | 234.61 | 204.95 |
| 2017-04-07 | 234.06 | 204.72 |
| 2017-04-10 | 233.91 | 204.32 |
| 2017-04-11 | 231.1 | 202.07 |
| 2017-04-12 | 229.95 | 201.78 |
| 2017-04-13 | 226.43 | 200.03 |
| 2017-04-18 | 220.41 | 195.94 |
| 2017-04-19 | 219.52 | 196.35 |
| 2017-04-20 | 220.16 | 197.22 |
| 2017-04-21 | 220.14 | 196.56 |
| 2017-04-24 | 227.69 | 203.25 |
| 2017-04-25 | 230.08 | 205.31 |
| 2017-04-26 | 231.61 | 206.51 |
| 2017-04-27 | 232.63 | 206.87 |
| 2017-04-28 | 236.38 | 208.92 |
| 2017-05-02 | 238.82 | 210.25 |
| 2017-05-03 | 240.06 | 210.49 |
| 2017-05-05 | 240.8 | 214.72 |
| 2017-05-09 | 246.14 | 218.54 |
| 2017-05-10 | 246.07 | 219.27 |
| 2017-05-11 | 246.28 | 218.54 |
| 2017-05-12 | 246.62 | 217.88 |
| 2017-05-15 | 247.9 | 219.2 |
| 2017-05-16 | 253.89 | 220.11 |
| 2017-05-17 | 251.77 | 218.69 |
| 2017-05-17 | 251.77 | 218.69 |
| 2017-05-18 | 251.77 | 216.31 |
| 2017-05-18 | 249.31 | 216.31 |
| 2017-05-18 | 249.31 | 216.31 |
| 2017-05-19 | 252.34 | 218.75 |
| 2017-05-22 | 252.56 | 219.6 |
| 2017-05-23 | 255.28 | 221.49 |
| 2017-05-24 | 255.39 | 221.39 |
| 2017-05-26 | 258.08 | 222.51 |
| 2017-05-29 | 258.48 | 222.98 |
| 2017-05-30 | 259.36 | 223.23 |
| 2017-05-31 | 260.48 | 224.34 |
| 2017-06-01 | 261.87 | 226.51 |
| 2017-06-02 | 262.85 | 228.13 |
| 2017-06-06 | 261.46 | 228.93 |
| 2017-06-07 | 260.56 | 227.94 |
| 2017-06-08 | 262.14 | 227.82 |
| 2017-06-09 | 265.3 | 228.53 |
| 2017-06-12 | 262.84 | 226.89 |
| 2017-06-13 | 263.34 | 228.38 |
| 2017-06-14 | 263.44 | 228.39 |
| 2017-06-15 | 261.65 | 226.56 |
| 2017-06-16 | 262.5 | 227.74 |
| 2017-06-19 | 263.33 | 229.47 |
| 2017-06-20 | 266.17 | 229.1 |
| 2017-06-21 | 266.57 | 228.87 |
| 2017-06-22 | 266.42 | 229.68 |
| 2017-06-23 | 265.49 | 229.53 |
| 2017-06-26 | 268.12 | 231.14 |
| 2017-06-27 | 267.49 | 229.91 |
| 2017-06-28 | 266.91 | 229.84 |
| 2017-06-29 | 266.86 | 227.67 |
| 2017-06-30 | 264.23 | 226.98 |
| 2017-07-03 | 263.21 | 227.18 |
| 2017-07-04 | 262.8 | 225.49 |
| 2017-07-05 | 262.23 | 224.83 |
| 2017-07-06 | 261.5 | 224.49 |
| 2017-07-07 | 261.67 | 224.52 |
| 2017-07-10 | 261.19 | 225.41 |
| 2017-07-11 | 261.52 | 225.01 |
| 2017-07-12 | 261.96 | 226.43 |
| 2017-07-13 | 262.99 | 227.36 |
| 2017-07-17 | 263.61 | 228.63 |
| 2017-07-18 | 263.82 | 227.89 |
| 2017-07-19 | 264.82 | 228.45 |
| 2017-07-20 | 263.11 | 228.17 |
| 2017-07-21 | 263.4 | 226.61 |
| 2017-07-24 | 263.33 | 225.57 |
| 2017-07-25 | 264.43 | 226.62 |
| 2017-07-26 | 263.45 | 226.24 |
| 2017-07-27 | 260.66 | 229.91 |
| 2017-07-28 | 259.11 | 225.31 |
| 2017-07-31 | 259 | 223.12 |
| 2017-08-01 | 258.82 | 223.8 |
| 2017-08-02 | 257.98 | 224.12 |
| 2017-08-03 | 258.42 | 224.76 |
| 2017-08-04 | 259.04 | 225.63 |
| 2017-08-07 | 258.7 | 226.74 |
| 2017-08-08 | 260.17 | 226.76 |
| 2017-08-09 | 257.41 | 224.92 |
| 2017-08-10 | 255.39 | 223.68 |
| 2017-08-11 | 252.63 | 220.68 |
| 2017-08-14 | 254.33 | 223.13 |
| 2017-08-16 | 256.81 | 224.67 |
| 2017-08-17 | 256.59 | 225.6 |
| 2017-08-18 | 254.85 | 223.95 |
| 2017-08-21 | 253.69 | 223.14 |
| 2017-08-22 | 253.4 | 223.46 |
| 2017-08-23 | 253.16 | 223.55 |
| 2017-08-24 | 253.89 | 223.24 |
| 2017-08-25 | 253.25 | 222.62 |
| 2017-08-28 | 252.72 | 220.68 |
| 2017-08-29 | 250.53 | 218.21 |
| 2017-08-30 | 251.35 | 219.43 |
| 2017-08-31 | 252.25 | 220.92 |
| 2017-09-01 | 253.77 | 221.76 |
| 2017-09-04 | 254.04 | 222.04 |
| 2017-09-05 | 255.62 | 222.88 |
| 2017-09-06 | 257.17 | 223.71 |
| 2017-09-07 | 257.72 | 224.8 |
| 2017-09-08 | 259.03 | 225.72 |
| 2017-09-11 | 259.49 | 226.97 |
| 2017-09-12 | 257.43 | 226.29 |
| 2017-09-13 | 259.03 | 226.65 |
| 2017-09-14 | 258.54 | 226.68 |
| 2017-09-15 | 258.16 | 225.54 |
| 2017-09-18 | 259.41 | 226.26 |
| 2017-09-19 | 259.67 | 226.56 |
| 2017-09-20 | 257.5 | 226.59 |
| 2017-09-21 | 258.2 | 227.54 |
| 2017-09-22 | 258.34 | 228.26 |
| 2017-09-25 | 257.4 | 228.02 |
| 2017-09-26 | 257.11 | 227.85 |
| 2017-09-27 | 257.9 | 228.74 |
| 2017-09-28 | 258.79 | 229.8 |
| 2017-09-29 | 260.82 | 231.04 |
| 2017-10-02 | 261.8 | 231.74 |
| 2017-10-03 | 263.8 | 232.63 |
| 2017-10-04 | 265.46 | 233.79 |
| 2017-10-05 | 265.76 | 234.06 |
| 2017-10-06 | 265.24 | 234.09 |
| 2017-10-09 | 264.64 | 234.59 |
| 2017-10-10 | 264.4 | 234.36 |
| 2017-10-10 | 264.9 | 234.59 |
| 2017-10-12 | 264.86 | 234.78 |
| 2017-10-13 | 264.68 | 234.8 |
| 2017-10-16 | 263.44 | 235.33 |
| 2017-10-17 | 264.26 | 236.41 |
| 2017-10-18 | 263.26 | 235.96 |
| 2017-10-19 | 260.46 | 232.97 |
| 2017-10-20 | 261.61 | 233.69 |
| 2017-10-23 | 260.22 | 232.92 |
| 2017-10-24 | 260.58 | 233.06 |
| 2017-10-25 | 260.93 | 230.53 |
| 2017-10-26 | 260.7 | 230.34 |
| 2017-10-27 | 259.76 | 232.11 |
| 2017-10-30 | 258.39 | 233.18 |
| 2017-10-31 | 258.33 | 233.24 |
| 2017-11-02 | 259.3 | 234.49 |
| 2017-11-03 | 259.24 | 234.21 |
| 2017-11-06 | 259.15 | 234.62 |
| 2017-11-07 | 258.15 | 233.71 |
| 2017-11-08 | 257.45 | 233.3 |
| 2017-11-09 | 254.92 | 230.24 |
| 2017-11-10 | 252.55 | 228.09 |
| 2017-11-13 | 249.29 | 225.16 |
| 2017-11-14 | 250 | 224.69 |
| 2017-11-15 | 245.54 | 221.33 |
| 2017-11-17 | 245.97 | 222.69 |
| 2017-11-20 | 247.36 | 223.35 |
| 2017-11-21 | 248.94 | 225.87 |
| 2017-11-22 | 251.14 | 227.17 |
| 2017-11-23 | 250.94 | 227.17 |
| 2017-11-24 | 249.52 | 227.06 |
| 2017-11-27 | 249.2 | 226.47 |
| 2017-11-28 | 250.6 | 227.44 |
| 2017-11-29 | 251.05 | 227.64 |
| 2017-11-30 | 250.82 | 228.08 |
| 2017-12-01 | 249.5 | 226.56 |
| 2017-12-04 | 250.53 | 227.4 |
| 2017-12-05 | 249.19 | 226.3 |
| 2017-12-06 | 247.12 | 225.32 |
| 2017-12-07 | 250.2 | 226.51 |
| 2017-12-08 | 253.52 | 226.9 |
| 2017-12-11 | 255.25 | 227.89 |
| 2017-12-12 | 256.92 | 228.68 |
| 2017-12-13 | 257.36 | 229.43 |
| 2017-12-15 | 257.97 | 229.43 |
| 2017-12-18 | 259.75 | 231.74 |
| 2017-12-19 | 259.37 | 231.91 |
| 2017-12-20 | 258.38 | 231.32 |
| 2017-12-21 | 259.51 | 231.95 |
| 2017-12-22 | 257.14 | 231.47 |
| 2017-12-27 | 256.45 | 231.84 |
| 2017-12-28 | 258.41 | 233.41 |
| 2017-12-29 | 259.2 | 234.15 |
| 2018-01-02 | 263.03 | 235.3 |
| 2018-01-03 | 264.86 | 237.72 |
| 2018-01-04 | 265.72 | 239.76 |
| 2018-01-05 | 266.79 | 242.03 |
| 2018-01-05 | 266.79 | 242.03 |
| 2018-01-08 | 268.91 | 244.75 |
| 2018-01-09 | 270.09 | 245.49 |
| 2018-01-10 | 270.84 | 245.05 |
| 2018-01-11 | 270.29 | 244.79 |
| 2018-01-12 | 271.78 | 246.1 |
| 2018-01-15 | 274.3 | 245.88 |
| 2018-01-16 | 274.47 | 246.61 |
| 2018-01-17 | 275.12 | 246.22 |
| 2018-01-18 | 274.4 | 246.75 |
| 2018-01-19 | 274.66 | 247.05 |
| 2018-01-22 | 274.64 | 248.12 |
| 2018-01-23 | 276.09 | 248.06 |
| 2018-01-24 | 277.2 | 247.65 |
| 2018-01-25 | 275.28 | 246.51 |
| 2018-01-26 | 274.41 | 246.42 |
| 2018-01-29 | 273.75 | 247.16 |
| 2018-01-30 | 271.44 | 244.68 |
| 2018-01-31 | 270.13 | 245.1 |